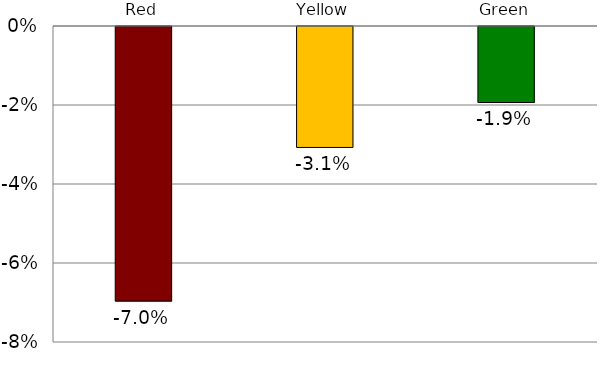
| Category | Series 2 |
|---|---|
| Red | -0.07 |
| Yellow | -0.031 |
| Green | -0.019 |